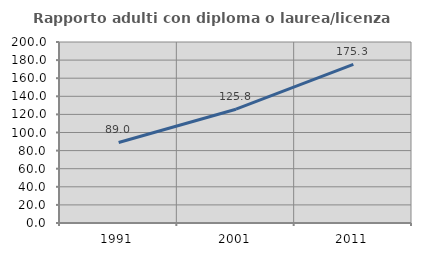
| Category | Rapporto adulti con diploma o laurea/licenza media  |
|---|---|
| 1991.0 | 89.006 |
| 2001.0 | 125.764 |
| 2011.0 | 175.307 |